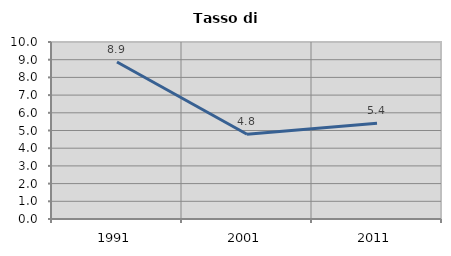
| Category | Tasso di disoccupazione   |
|---|---|
| 1991.0 | 8.871 |
| 2001.0 | 4.789 |
| 2011.0 | 5.415 |